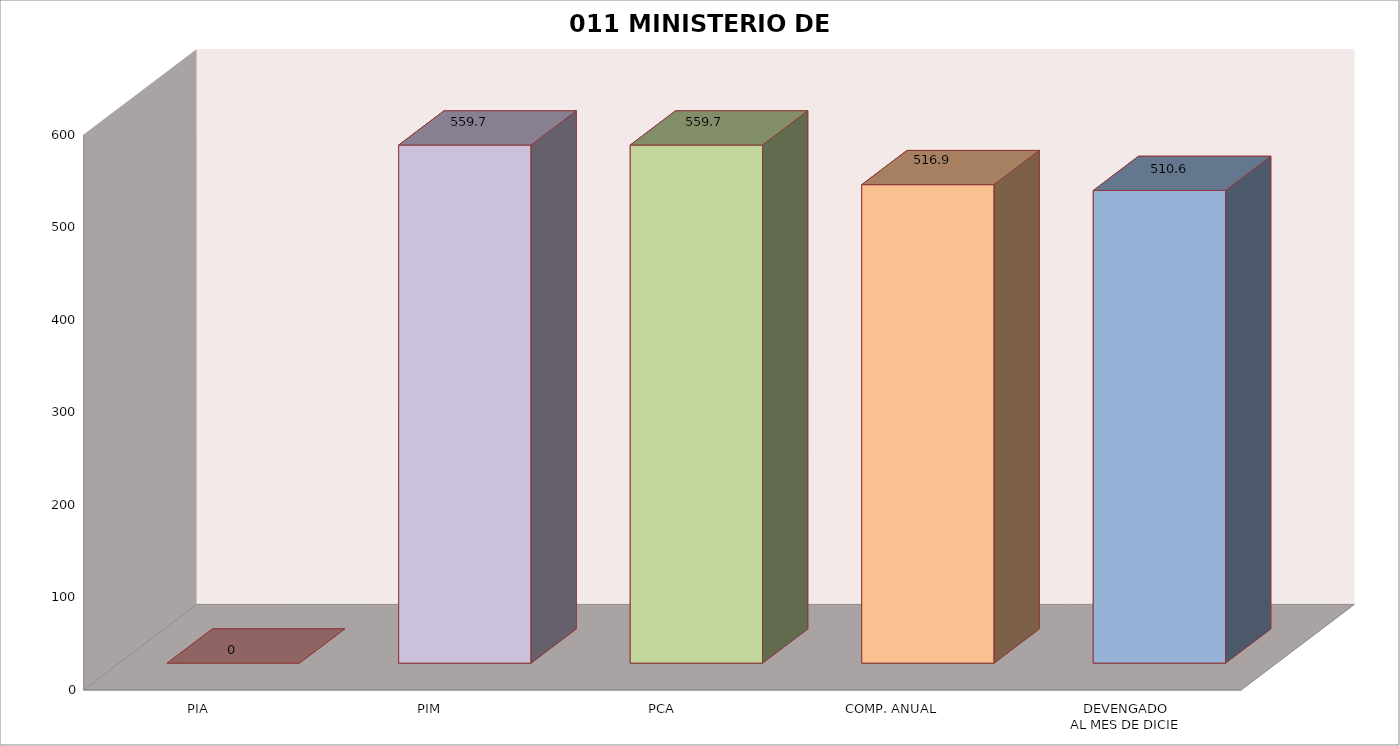
| Category | 011 MINISTERIO DE SALUD |
|---|---|
| PIA | 0 |
| PIM | 559.657 |
| PCA | 559.657 |
| COMP. ANUAL | 516.881 |
| DEVENGADO
AL MES DE DICIE | 510.589 |